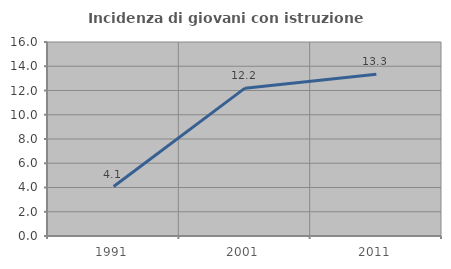
| Category | Incidenza di giovani con istruzione universitaria |
|---|---|
| 1991.0 | 4.082 |
| 2001.0 | 12.195 |
| 2011.0 | 13.333 |